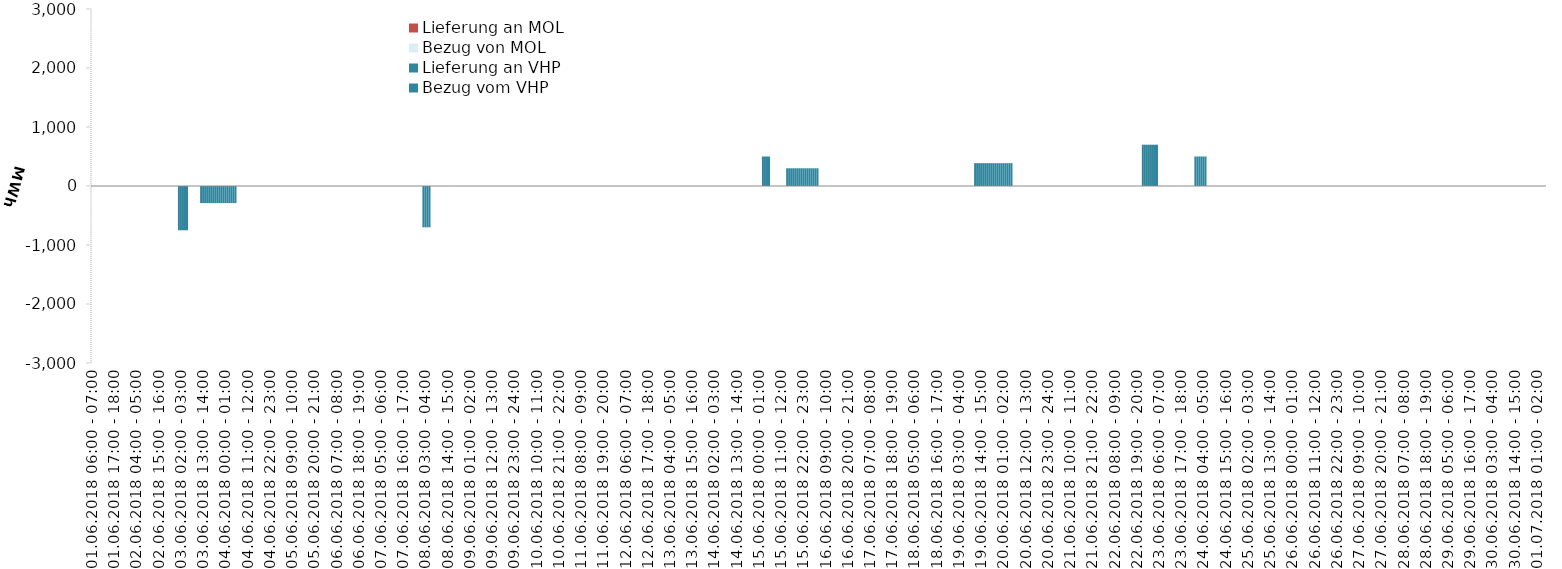
| Category | Bezug vom VHP | Lieferung an VHP | Bezug von MOL | Lieferung an MOL |
|---|---|---|---|---|
| 01.06.2018 06:00 - 07:00 | 0 | 0 | 0 | 0 |
| 01.06.2018 07:00 - 08:00 | 0 | 0 | 0 | 0 |
| 01.06.2018 08:00 - 09:00 | 0 | 0 | 0 | 0 |
| 01.06.2018 09:00 - 10:00 | 0 | 0 | 0 | 0 |
| 01.06.2018 10:00 - 11:00 | 0 | 0 | 0 | 0 |
| 01.06.2018 11:00 - 12:00 | 0 | 0 | 0 | 0 |
| 01.06.2018 12:00 - 13:00 | 0 | 0 | 0 | 0 |
| 01.06.2018 13:00 - 14:00 | 0 | 0 | 0 | 0 |
| 01.06.2018 14:00 - 15:00 | 0 | 0 | 0 | 0 |
| 01.06.2018 15:00 - 16:00 | 0 | 0 | 0 | 0 |
| 01.06.2018 16:00 - 17:00 | 0 | 0 | 0 | 0 |
| 01.06.2018 17:00 - 18:00 | 0 | 0 | 0 | 0 |
| 01.06.2018 18:00 - 19:00 | 0 | 0 | 0 | 0 |
| 01.06.2018 19:00 - 20:00 | 0 | 0 | 0 | 0 |
| 01.06.2018 20:00 - 21:00 | 0 | 0 | 0 | 0 |
| 01.06.2018 21:00 - 22:00 | 0 | 0 | 0 | 0 |
| 01.06.2018 22:00 - 23:00 | 0 | 0 | 0 | 0 |
| 01.06.2018 23:00 - 24:00 | 0 | 0 | 0 | 0 |
| 02.06.2018 00:00 - 01:00 | 0 | 0 | 0 | 0 |
| 02.06.2018 01:00 - 02:00 | 0 | 0 | 0 | 0 |
| 02.06.2018 02:00 - 03:00 | 0 | 0 | 0 | 0 |
| 02.06.2018 03:00 - 04:00 | 0 | 0 | 0 | 0 |
| 02.06.2018 04:00 - 05:00 | 0 | 0 | 0 | 0 |
| 02.06.2018 05:00 - 06:00 | 0 | 0 | 0 | 0 |
| 02.06.2018 06:00 - 07:00 | 0 | 0 | 0 | 0 |
| 02.06.2018 07:00 - 08:00 | 0 | 0 | 0 | 0 |
| 02.06.2018 08:00 - 09:00 | 0 | 0 | 0 | 0 |
| 02.06.2018 09:00 - 10:00 | 0 | 0 | 0 | 0 |
| 02.06.2018 10:00 - 11:00 | 0 | 0 | 0 | 0 |
| 02.06.2018 11:00 - 12:00 | 0 | 0 | 0 | 0 |
| 02.06.2018 12:00 - 13:00 | 0 | 0 | 0 | 0 |
| 02.06.2018 13:00 - 14:00 | 0 | 0 | 0 | 0 |
| 02.06.2018 14:00 - 15:00 | 0 | 0 | 0 | 0 |
| 02.06.2018 15:00 - 16:00 | 0 | 0 | 0 | 0 |
| 02.06.2018 16:00 - 17:00 | 0 | 0 | 0 | 0 |
| 02.06.2018 17:00 - 18:00 | 0 | 0 | 0 | 0 |
| 02.06.2018 18:00 - 19:00 | 0 | 0 | 0 | 0 |
| 02.06.2018 19:00 - 20:00 | 0 | 0 | 0 | 0 |
| 02.06.2018 20:00 - 21:00 | 0 | 0 | 0 | 0 |
| 02.06.2018 21:00 - 22:00 | 0 | 0 | 0 | 0 |
| 02.06.2018 22:00 - 23:00 | 0 | 0 | 0 | 0 |
| 02.06.2018 23:00 - 24:00 | 0 | 0 | 0 | 0 |
| 03.06.2018 00:00 - 01:00 | 0 | 0 | 0 | 0 |
| 03.06.2018 01:00 - 02:00 | 0 | -750 | 0 | 0 |
| 03.06.2018 02:00 - 03:00 | 0 | -750 | 0 | 0 |
| 03.06.2018 03:00 - 04:00 | 0 | -750 | 0 | 0 |
| 03.06.2018 04:00 - 05:00 | 0 | -750 | 0 | 0 |
| 03.06.2018 05:00 - 06:00 | 0 | -750 | 0 | 0 |
| 03.06.2018 06:00 - 07:00 | 0 | 0 | 0 | 0 |
| 03.06.2018 07:00 - 08:00 | 0 | 0 | 0 | 0 |
| 03.06.2018 08:00 - 09:00 | 0 | 0 | 0 | 0 |
| 03.06.2018 09:00 - 10:00 | 0 | 0 | 0 | 0 |
| 03.06.2018 10:00 - 11:00 | 0 | 0 | 0 | 0 |
| 03.06.2018 11:00 - 12:00 | 0 | 0 | 0 | 0 |
| 03.06.2018 12:00 - 13:00 | 0 | -290 | 0 | 0 |
| 03.06.2018 13:00 - 14:00 | 0 | -290 | 0 | 0 |
| 03.06.2018 14:00 - 15:00 | 0 | -290 | 0 | 0 |
| 03.06.2018 15:00 - 16:00 | 0 | -290 | 0 | 0 |
| 03.06.2018 16:00 - 17:00 | 0 | -290 | 0 | 0 |
| 03.06.2018 17:00 - 18:00 | 0 | -290 | 0 | 0 |
| 03.06.2018 18:00 - 19:00 | 0 | -290 | 0 | 0 |
| 03.06.2018 19:00 - 20:00 | 0 | -290 | 0 | 0 |
| 03.06.2018 20:00 - 21:00 | 0 | -290 | 0 | 0 |
| 03.06.2018 21:00 - 22:00 | 0 | -290 | 0 | 0 |
| 03.06.2018 22:00 - 23:00 | 0 | -290 | 0 | 0 |
| 03.06.2018 23:00 - 24:00 | 0 | -290 | 0 | 0 |
| 04.06.2018 00:00 - 01:00 | 0 | -290 | 0 | 0 |
| 04.06.2018 01:00 - 02:00 | 0 | -290 | 0 | 0 |
| 04.06.2018 02:00 - 03:00 | 0 | -290 | 0 | 0 |
| 04.06.2018 03:00 - 04:00 | 0 | -290 | 0 | 0 |
| 04.06.2018 04:00 - 05:00 | 0 | -290 | 0 | 0 |
| 04.06.2018 05:00 - 06:00 | 0 | -290 | 0 | 0 |
| 04.06.2018 06:00 - 07:00 | 0 | 0 | 0 | 0 |
| 04.06.2018 07:00 - 08:00 | 0 | 0 | 0 | 0 |
| 04.06.2018 08:00 - 09:00 | 0 | 0 | 0 | 0 |
| 04.06.2018 09:00 - 10:00 | 0 | 0 | 0 | 0 |
| 04.06.2018 10:00 - 11:00 | 0 | 0 | 0 | 0 |
| 04.06.2018 11:00 - 12:00 | 0 | 0 | 0 | 0 |
| 04.06.2018 12:00 - 13:00 | 0 | 0 | 0 | 0 |
| 04.06.2018 13:00 - 14:00 | 0 | 0 | 0 | 0 |
| 04.06.2018 14:00 - 15:00 | 0 | 0 | 0 | 0 |
| 04.06.2018 15:00 - 16:00 | 0 | 0 | 0 | 0 |
| 04.06.2018 16:00 - 17:00 | 0 | 0 | 0 | 0 |
| 04.06.2018 17:00 - 18:00 | 0 | 0 | 0 | 0 |
| 04.06.2018 18:00 - 19:00 | 0 | 0 | 0 | 0 |
| 04.06.2018 19:00 - 20:00 | 0 | 0 | 0 | 0 |
| 04.06.2018 20:00 - 21:00 | 0 | 0 | 0 | 0 |
| 04.06.2018 21:00 - 22:00 | 0 | 0 | 0 | 0 |
| 04.06.2018 22:00 - 23:00 | 0 | 0 | 0 | 0 |
| 04.06.2018 23:00 - 24:00 | 0 | 0 | 0 | 0 |
| 05.06.2018 00:00 - 01:00 | 0 | 0 | 0 | 0 |
| 05.06.2018 01:00 - 02:00 | 0 | 0 | 0 | 0 |
| 05.06.2018 02:00 - 03:00 | 0 | 0 | 0 | 0 |
| 05.06.2018 03:00 - 04:00 | 0 | 0 | 0 | 0 |
| 05.06.2018 04:00 - 05:00 | 0 | 0 | 0 | 0 |
| 05.06.2018 05:00 - 06:00 | 0 | 0 | 0 | 0 |
| 05.06.2018 06:00 - 07:00 | 0 | 0 | 0 | 0 |
| 05.06.2018 07:00 - 08:00 | 0 | 0 | 0 | 0 |
| 05.06.2018 08:00 - 09:00 | 0 | 0 | 0 | 0 |
| 05.06.2018 09:00 - 10:00 | 0 | 0 | 0 | 0 |
| 05.06.2018 10:00 - 11:00 | 0 | 0 | 0 | 0 |
| 05.06.2018 11:00 - 12:00 | 0 | 0 | 0 | 0 |
| 05.06.2018 12:00 - 13:00 | 0 | 0 | 0 | 0 |
| 05.06.2018 13:00 - 14:00 | 0 | 0 | 0 | 0 |
| 05.06.2018 14:00 - 15:00 | 0 | 0 | 0 | 0 |
| 05.06.2018 15:00 - 16:00 | 0 | 0 | 0 | 0 |
| 05.06.2018 16:00 - 17:00 | 0 | 0 | 0 | 0 |
| 05.06.2018 17:00 - 18:00 | 0 | 0 | 0 | 0 |
| 05.06.2018 18:00 - 19:00 | 0 | 0 | 0 | 0 |
| 05.06.2018 19:00 - 20:00 | 0 | 0 | 0 | 0 |
| 05.06.2018 20:00 - 21:00 | 0 | 0 | 0 | 0 |
| 05.06.2018 21:00 - 22:00 | 0 | 0 | 0 | 0 |
| 05.06.2018 22:00 - 23:00 | 0 | 0 | 0 | 0 |
| 05.06.2018 23:00 - 24:00 | 0 | 0 | 0 | 0 |
| 06.06.2018 00:00 - 01:00 | 0 | 0 | 0 | 0 |
| 06.06.2018 01:00 - 02:00 | 0 | 0 | 0 | 0 |
| 06.06.2018 02:00 - 03:00 | 0 | 0 | 0 | 0 |
| 06.06.2018 03:00 - 04:00 | 0 | 0 | 0 | 0 |
| 06.06.2018 04:00 - 05:00 | 0 | 0 | 0 | 0 |
| 06.06.2018 05:00 - 06:00 | 0 | 0 | 0 | 0 |
| 06.06.2018 06:00 - 07:00 | 0 | 0 | 0 | 0 |
| 06.06.2018 07:00 - 08:00 | 0 | 0 | 0 | 0 |
| 06.06.2018 08:00 - 09:00 | 0 | 0 | 0 | 0 |
| 06.06.2018 09:00 - 10:00 | 0 | 0 | 0 | 0 |
| 06.06.2018 10:00 - 11:00 | 0 | 0 | 0 | 0 |
| 06.06.2018 11:00 - 12:00 | 0 | 0 | 0 | 0 |
| 06.06.2018 12:00 - 13:00 | 0 | 0 | 0 | 0 |
| 06.06.2018 13:00 - 14:00 | 0 | 0 | 0 | 0 |
| 06.06.2018 14:00 - 15:00 | 0 | 0 | 0 | 0 |
| 06.06.2018 15:00 - 16:00 | 0 | 0 | 0 | 0 |
| 06.06.2018 16:00 - 17:00 | 0 | 0 | 0 | 0 |
| 06.06.2018 17:00 - 18:00 | 0 | 0 | 0 | 0 |
| 06.06.2018 18:00 - 19:00 | 0 | 0 | 0 | 0 |
| 06.06.2018 19:00 - 20:00 | 0 | 0 | 0 | 0 |
| 06.06.2018 20:00 - 21:00 | 0 | 0 | 0 | 0 |
| 06.06.2018 21:00 - 22:00 | 0 | 0 | 0 | 0 |
| 06.06.2018 22:00 - 23:00 | 0 | 0 | 0 | 0 |
| 06.06.2018 23:00 - 24:00 | 0 | 0 | 0 | 0 |
| 07.06.2018 00:00 - 01:00 | 0 | 0 | 0 | 0 |
| 07.06.2018 01:00 - 02:00 | 0 | 0 | 0 | 0 |
| 07.06.2018 02:00 - 03:00 | 0 | 0 | 0 | 0 |
| 07.06.2018 03:00 - 04:00 | 0 | 0 | 0 | 0 |
| 07.06.2018 04:00 - 05:00 | 0 | 0 | 0 | 0 |
| 07.06.2018 05:00 - 06:00 | 0 | 0 | 0 | 0 |
| 07.06.2018 06:00 - 07:00 | 0 | 0 | 0 | 0 |
| 07.06.2018 07:00 - 08:00 | 0 | 0 | 0 | 0 |
| 07.06.2018 08:00 - 09:00 | 0 | 0 | 0 | 0 |
| 07.06.2018 09:00 - 10:00 | 0 | 0 | 0 | 0 |
| 07.06.2018 10:00 - 11:00 | 0 | 0 | 0 | 0 |
| 07.06.2018 11:00 - 12:00 | 0 | 0 | 0 | 0 |
| 07.06.2018 12:00 - 13:00 | 0 | 0 | 0 | 0 |
| 07.06.2018 13:00 - 14:00 | 0 | 0 | 0 | 0 |
| 07.06.2018 14:00 - 15:00 | 0 | 0 | 0 | 0 |
| 07.06.2018 15:00 - 16:00 | 0 | 0 | 0 | 0 |
| 07.06.2018 16:00 - 17:00 | 0 | 0 | 0 | 0 |
| 07.06.2018 17:00 - 18:00 | 0 | 0 | 0 | 0 |
| 07.06.2018 18:00 - 19:00 | 0 | 0 | 0 | 0 |
| 07.06.2018 19:00 - 20:00 | 0 | 0 | 0 | 0 |
| 07.06.2018 20:00 - 21:00 | 0 | 0 | 0 | 0 |
| 07.06.2018 21:00 - 22:00 | 0 | 0 | 0 | 0 |
| 07.06.2018 22:00 - 23:00 | 0 | 0 | 0 | 0 |
| 07.06.2018 23:00 - 24:00 | 0 | 0 | 0 | 0 |
| 08.06.2018 00:00 - 01:00 | 0 | 0 | 0 | 0 |
| 08.06.2018 01:00 - 02:00 | 0 | 0 | 0 | 0 |
| 08.06.2018 02:00 - 03:00 | 0 | -700 | 0 | 0 |
| 08.06.2018 03:00 - 04:00 | 0 | -700 | 0 | 0 |
| 08.06.2018 04:00 - 05:00 | 0 | -700 | 0 | 0 |
| 08.06.2018 05:00 - 06:00 | 0 | -700 | 0 | 0 |
| 08.06.2018 06:00 - 07:00 | 0 | 0 | 0 | 0 |
| 08.06.2018 07:00 - 08:00 | 0 | 0 | 0 | 0 |
| 08.06.2018 08:00 - 09:00 | 0 | 0 | 0 | 0 |
| 08.06.2018 09:00 - 10:00 | 0 | 0 | 0 | 0 |
| 08.06.2018 10:00 - 11:00 | 0 | 0 | 0 | 0 |
| 08.06.2018 11:00 - 12:00 | 0 | 0 | 0 | 0 |
| 08.06.2018 12:00 - 13:00 | 0 | 0 | 0 | 0 |
| 08.06.2018 13:00 - 14:00 | 0 | 0 | 0 | 0 |
| 08.06.2018 14:00 - 15:00 | 0 | 0 | 0 | 0 |
| 08.06.2018 15:00 - 16:00 | 0 | 0 | 0 | 0 |
| 08.06.2018 16:00 - 17:00 | 0 | 0 | 0 | 0 |
| 08.06.2018 17:00 - 18:00 | 0 | 0 | 0 | 0 |
| 08.06.2018 18:00 - 19:00 | 0 | 0 | 0 | 0 |
| 08.06.2018 19:00 - 20:00 | 0 | 0 | 0 | 0 |
| 08.06.2018 20:00 - 21:00 | 0 | 0 | 0 | 0 |
| 08.06.2018 21:00 - 22:00 | 0 | 0 | 0 | 0 |
| 08.06.2018 22:00 - 23:00 | 0 | 0 | 0 | 0 |
| 08.06.2018 23:00 - 24:00 | 0 | 0 | 0 | 0 |
| 09.06.2018 00:00 - 01:00 | 0 | 0 | 0 | 0 |
| 09.06.2018 01:00 - 02:00 | 0 | 0 | 0 | 0 |
| 09.06.2018 02:00 - 03:00 | 0 | 0 | 0 | 0 |
| 09.06.2018 03:00 - 04:00 | 0 | 0 | 0 | 0 |
| 09.06.2018 04:00 - 05:00 | 0 | 0 | 0 | 0 |
| 09.06.2018 05:00 - 06:00 | 0 | 0 | 0 | 0 |
| 09.06.2018 06:00 - 07:00 | 0 | 0 | 0 | 0 |
| 09.06.2018 07:00 - 08:00 | 0 | 0 | 0 | 0 |
| 09.06.2018 08:00 - 09:00 | 0 | 0 | 0 | 0 |
| 09.06.2018 09:00 - 10:00 | 0 | 0 | 0 | 0 |
| 09.06.2018 10:00 - 11:00 | 0 | 0 | 0 | 0 |
| 09.06.2018 11:00 - 12:00 | 0 | 0 | 0 | 0 |
| 09.06.2018 12:00 - 13:00 | 0 | 0 | 0 | 0 |
| 09.06.2018 13:00 - 14:00 | 0 | 0 | 0 | 0 |
| 09.06.2018 14:00 - 15:00 | 0 | 0 | 0 | 0 |
| 09.06.2018 15:00 - 16:00 | 0 | 0 | 0 | 0 |
| 09.06.2018 16:00 - 17:00 | 0 | 0 | 0 | 0 |
| 09.06.2018 17:00 - 18:00 | 0 | 0 | 0 | 0 |
| 09.06.2018 18:00 - 19:00 | 0 | 0 | 0 | 0 |
| 09.06.2018 19:00 - 20:00 | 0 | 0 | 0 | 0 |
| 09.06.2018 20:00 - 21:00 | 0 | 0 | 0 | 0 |
| 09.06.2018 21:00 - 22:00 | 0 | 0 | 0 | 0 |
| 09.06.2018 22:00 - 23:00 | 0 | 0 | 0 | 0 |
| 09.06.2018 23:00 - 24:00 | 0 | 0 | 0 | 0 |
| 10.06.2018 00:00 - 01:00 | 0 | 0 | 0 | 0 |
| 10.06.2018 01:00 - 02:00 | 0 | 0 | 0 | 0 |
| 10.06.2018 02:00 - 03:00 | 0 | 0 | 0 | 0 |
| 10.06.2018 03:00 - 04:00 | 0 | 0 | 0 | 0 |
| 10.06.2018 04:00 - 05:00 | 0 | 0 | 0 | 0 |
| 10.06.2018 05:00 - 06:00 | 0 | 0 | 0 | 0 |
| 10.06.2018 06:00 - 07:00 | 0 | 0 | 0 | 0 |
| 10.06.2018 07:00 - 08:00 | 0 | 0 | 0 | 0 |
| 10.06.2018 08:00 - 09:00 | 0 | 0 | 0 | 0 |
| 10.06.2018 09:00 - 10:00 | 0 | 0 | 0 | 0 |
| 10.06.2018 10:00 - 11:00 | 0 | 0 | 0 | 0 |
| 10.06.2018 11:00 - 12:00 | 0 | 0 | 0 | 0 |
| 10.06.2018 12:00 - 13:00 | 0 | 0 | 0 | 0 |
| 10.06.2018 13:00 - 14:00 | 0 | 0 | 0 | 0 |
| 10.06.2018 14:00 - 15:00 | 0 | 0 | 0 | 0 |
| 10.06.2018 15:00 - 16:00 | 0 | 0 | 0 | 0 |
| 10.06.2018 16:00 - 17:00 | 0 | 0 | 0 | 0 |
| 10.06.2018 17:00 - 18:00 | 0 | 0 | 0 | 0 |
| 10.06.2018 18:00 - 19:00 | 0 | 0 | 0 | 0 |
| 10.06.2018 19:00 - 20:00 | 0 | 0 | 0 | 0 |
| 10.06.2018 20:00 - 21:00 | 0 | 0 | 0 | 0 |
| 10.06.2018 21:00 - 22:00 | 0 | 0 | 0 | 0 |
| 10.06.2018 22:00 - 23:00 | 0 | 0 | 0 | 0 |
| 10.06.2018 23:00 - 24:00 | 0 | 0 | 0 | 0 |
| 11.06.2018 00:00 - 01:00 | 0 | 0 | 0 | 0 |
| 11.06.2018 01:00 - 02:00 | 0 | 0 | 0 | 0 |
| 11.06.2018 02:00 - 03:00 | 0 | 0 | 0 | 0 |
| 11.06.2018 03:00 - 04:00 | 0 | 0 | 0 | 0 |
| 11.06.2018 04:00 - 05:00 | 0 | 0 | 0 | 0 |
| 11.06.2018 05:00 - 06:00 | 0 | 0 | 0 | 0 |
| 11.06.2018 06:00 - 07:00 | 0 | 0 | 0 | 0 |
| 11.06.2018 07:00 - 08:00 | 0 | 0 | 0 | 0 |
| 11.06.2018 08:00 - 09:00 | 0 | 0 | 0 | 0 |
| 11.06.2018 09:00 - 10:00 | 0 | 0 | 0 | 0 |
| 11.06.2018 10:00 - 11:00 | 0 | 0 | 0 | 0 |
| 11.06.2018 11:00 - 12:00 | 0 | 0 | 0 | 0 |
| 11.06.2018 12:00 - 13:00 | 0 | 0 | 0 | 0 |
| 11.06.2018 13:00 - 14:00 | 0 | 0 | 0 | 0 |
| 11.06.2018 14:00 - 15:00 | 0 | 0 | 0 | 0 |
| 11.06.2018 15:00 - 16:00 | 0 | 0 | 0 | 0 |
| 11.06.2018 16:00 - 17:00 | 0 | 0 | 0 | 0 |
| 11.06.2018 17:00 - 18:00 | 0 | 0 | 0 | 0 |
| 11.06.2018 18:00 - 19:00 | 0 | 0 | 0 | 0 |
| 11.06.2018 19:00 - 20:00 | 0 | 0 | 0 | 0 |
| 11.06.2018 20:00 - 21:00 | 0 | 0 | 0 | 0 |
| 11.06.2018 21:00 - 22:00 | 0 | 0 | 0 | 0 |
| 11.06.2018 22:00 - 23:00 | 0 | 0 | 0 | 0 |
| 11.06.2018 23:00 - 24:00 | 0 | 0 | 0 | 0 |
| 12.06.2018 00:00 - 01:00 | 0 | 0 | 0 | 0 |
| 12.06.2018 01:00 - 02:00 | 0 | 0 | 0 | 0 |
| 12.06.2018 02:00 - 03:00 | 0 | 0 | 0 | 0 |
| 12.06.2018 03:00 - 04:00 | 0 | 0 | 0 | 0 |
| 12.06.2018 04:00 - 05:00 | 0 | 0 | 0 | 0 |
| 12.06.2018 05:00 - 06:00 | 0 | 0 | 0 | 0 |
| 12.06.2018 06:00 - 07:00 | 0 | 0 | 0 | 0 |
| 12.06.2018 07:00 - 08:00 | 0 | 0 | 0 | 0 |
| 12.06.2018 08:00 - 09:00 | 0 | 0 | 0 | 0 |
| 12.06.2018 09:00 - 10:00 | 0 | 0 | 0 | 0 |
| 12.06.2018 10:00 - 11:00 | 0 | 0 | 0 | 0 |
| 12.06.2018 11:00 - 12:00 | 0 | 0 | 0 | 0 |
| 12.06.2018 12:00 - 13:00 | 0 | 0 | 0 | 0 |
| 12.06.2018 13:00 - 14:00 | 0 | 0 | 0 | 0 |
| 12.06.2018 14:00 - 15:00 | 0 | 0 | 0 | 0 |
| 12.06.2018 15:00 - 16:00 | 0 | 0 | 0 | 0 |
| 12.06.2018 16:00 - 17:00 | 0 | 0 | 0 | 0 |
| 12.06.2018 17:00 - 18:00 | 0 | 0 | 0 | 0 |
| 12.06.2018 18:00 - 19:00 | 0 | 0 | 0 | 0 |
| 12.06.2018 19:00 - 20:00 | 0 | 0 | 0 | 0 |
| 12.06.2018 20:00 - 21:00 | 0 | 0 | 0 | 0 |
| 12.06.2018 21:00 - 22:00 | 0 | 0 | 0 | 0 |
| 12.06.2018 22:00 - 23:00 | 0 | 0 | 0 | 0 |
| 12.06.2018 23:00 - 24:00 | 0 | 0 | 0 | 0 |
| 13.06.2018 00:00 - 01:00 | 0 | 0 | 0 | 0 |
| 13.06.2018 01:00 - 02:00 | 0 | 0 | 0 | 0 |
| 13.06.2018 02:00 - 03:00 | 0 | 0 | 0 | 0 |
| 13.06.2018 03:00 - 04:00 | 0 | 0 | 0 | 0 |
| 13.06.2018 04:00 - 05:00 | 0 | 0 | 0 | 0 |
| 13.06.2018 05:00 - 06:00 | 0 | 0 | 0 | 0 |
| 13.06.2018 06:00 - 07:00 | 0 | 0 | 0 | 0 |
| 13.06.2018 07:00 - 08:00 | 0 | 0 | 0 | 0 |
| 13.06.2018 08:00 - 09:00 | 0 | 0 | 0 | 0 |
| 13.06.2018 09:00 - 10:00 | 0 | 0 | 0 | 0 |
| 13.06.2018 10:00 - 11:00 | 0 | 0 | 0 | 0 |
| 13.06.2018 11:00 - 12:00 | 0 | 0 | 0 | 0 |
| 13.06.2018 12:00 - 13:00 | 0 | 0 | 0 | 0 |
| 13.06.2018 13:00 - 14:00 | 0 | 0 | 0 | 0 |
| 13.06.2018 14:00 - 15:00 | 0 | 0 | 0 | 0 |
| 13.06.2018 15:00 - 16:00 | 0 | 0 | 0 | 0 |
| 13.06.2018 16:00 - 17:00 | 0 | 0 | 0 | 0 |
| 13.06.2018 17:00 - 18:00 | 0 | 0 | 0 | 0 |
| 13.06.2018 18:00 - 19:00 | 0 | 0 | 0 | 0 |
| 13.06.2018 19:00 - 20:00 | 0 | 0 | 0 | 0 |
| 13.06.2018 20:00 - 21:00 | 0 | 0 | 0 | 0 |
| 13.06.2018 21:00 - 22:00 | 0 | 0 | 0 | 0 |
| 13.06.2018 22:00 - 23:00 | 0 | 0 | 0 | 0 |
| 13.06.2018 23:00 - 24:00 | 0 | 0 | 0 | 0 |
| 14.06.2018 00:00 - 01:00 | 0 | 0 | 0 | 0 |
| 14.06.2018 01:00 - 02:00 | 0 | 0 | 0 | 0 |
| 14.06.2018 02:00 - 03:00 | 0 | 0 | 0 | 0 |
| 14.06.2018 03:00 - 04:00 | 0 | 0 | 0 | 0 |
| 14.06.2018 04:00 - 05:00 | 0 | 0 | 0 | 0 |
| 14.06.2018 05:00 - 06:00 | 0 | 0 | 0 | 0 |
| 14.06.2018 06:00 - 07:00 | 0 | 0 | 0 | 0 |
| 14.06.2018 07:00 - 08:00 | 0 | 0 | 0 | 0 |
| 14.06.2018 08:00 - 09:00 | 0 | 0 | 0 | 0 |
| 14.06.2018 09:00 - 10:00 | 0 | 0 | 0 | 0 |
| 14.06.2018 10:00 - 11:00 | 0 | 0 | 0 | 0 |
| 14.06.2018 11:00 - 12:00 | 0 | 0 | 0 | 0 |
| 14.06.2018 12:00 - 13:00 | 0 | 0 | 0 | 0 |
| 14.06.2018 13:00 - 14:00 | 0 | 0 | 0 | 0 |
| 14.06.2018 14:00 - 15:00 | 0 | 0 | 0 | 0 |
| 14.06.2018 15:00 - 16:00 | 0 | 0 | 0 | 0 |
| 14.06.2018 16:00 - 17:00 | 0 | 0 | 0 | 0 |
| 14.06.2018 17:00 - 18:00 | 0 | 0 | 0 | 0 |
| 14.06.2018 18:00 - 19:00 | 0 | 0 | 0 | 0 |
| 14.06.2018 19:00 - 20:00 | 0 | 0 | 0 | 0 |
| 14.06.2018 20:00 - 21:00 | 0 | 0 | 0 | 0 |
| 14.06.2018 21:00 - 22:00 | 0 | 0 | 0 | 0 |
| 14.06.2018 22:00 - 23:00 | 0 | 0 | 0 | 0 |
| 14.06.2018 23:00 - 24:00 | 0 | 0 | 0 | 0 |
| 15.06.2018 00:00 - 01:00 | 0 | 0 | 0 | 0 |
| 15.06.2018 01:00 - 02:00 | 0 | 0 | 0 | 0 |
| 15.06.2018 02:00 - 03:00 | 500 | 0 | 0 | 0 |
| 15.06.2018 03:00 - 04:00 | 500 | 0 | 0 | 0 |
| 15.06.2018 04:00 - 05:00 | 500 | 0 | 0 | 0 |
| 15.06.2018 05:00 - 06:00 | 500 | 0 | 0 | 0 |
| 15.06.2018 06:00 - 07:00 | 0 | 0 | 0 | 0 |
| 15.06.2018 07:00 - 08:00 | 0 | 0 | 0 | 0 |
| 15.06.2018 08:00 - 09:00 | 0 | 0 | 0 | 0 |
| 15.06.2018 09:00 - 10:00 | 0 | 0 | 0 | 0 |
| 15.06.2018 10:00 - 11:00 | 0 | 0 | 0 | 0 |
| 15.06.2018 11:00 - 12:00 | 0 | 0 | 0 | 0 |
| 15.06.2018 12:00 - 13:00 | 0 | 0 | 0 | 0 |
| 15.06.2018 13:00 - 14:00 | 0 | 0 | 0 | 0 |
| 15.06.2018 14:00 - 15:00 | 300 | 0 | 0 | 0 |
| 15.06.2018 15:00 - 16:00 | 300 | 0 | 0 | 0 |
| 15.06.2018 16:00 - 17:00 | 300 | 0 | 0 | 0 |
| 15.06.2018 17:00 - 18:00 | 300 | 0 | 0 | 0 |
| 15.06.2018 18:00 - 19:00 | 300 | 0 | 0 | 0 |
| 15.06.2018 19:00 - 20:00 | 300 | 0 | 0 | 0 |
| 15.06.2018 20:00 - 21:00 | 300 | 0 | 0 | 0 |
| 15.06.2018 21:00 - 22:00 | 300 | 0 | 0 | 0 |
| 15.06.2018 22:00 - 23:00 | 300 | 0 | 0 | 0 |
| 15.06.2018 23:00 - 24:00 | 300 | 0 | 0 | 0 |
| 16.06.2018 00:00 - 01:00 | 300 | 0 | 0 | 0 |
| 16.06.2018 01:00 - 02:00 | 300 | 0 | 0 | 0 |
| 16.06.2018 02:00 - 03:00 | 300 | 0 | 0 | 0 |
| 16.06.2018 03:00 - 04:00 | 300 | 0 | 0 | 0 |
| 16.06.2018 04:00 - 05:00 | 300 | 0 | 0 | 0 |
| 16.06.2018 05:00 - 06:00 | 300 | 0 | 0 | 0 |
| 16.06.2018 06:00 - 07:00 | 0 | 0 | 0 | 0 |
| 16.06.2018 07:00 - 08:00 | 0 | 0 | 0 | 0 |
| 16.06.2018 08:00 - 09:00 | 0 | 0 | 0 | 0 |
| 16.06.2018 09:00 - 10:00 | 0 | 0 | 0 | 0 |
| 16.06.2018 10:00 - 11:00 | 0 | 0 | 0 | 0 |
| 16.06.2018 11:00 - 12:00 | 0 | 0 | 0 | 0 |
| 16.06.2018 12:00 - 13:00 | 0 | 0 | 0 | 0 |
| 16.06.2018 13:00 - 14:00 | 0 | 0 | 0 | 0 |
| 16.06.2018 14:00 - 15:00 | 0 | 0 | 0 | 0 |
| 16.06.2018 15:00 - 16:00 | 0 | 0 | 0 | 0 |
| 16.06.2018 16:00 - 17:00 | 0 | 0 | 0 | 0 |
| 16.06.2018 17:00 - 18:00 | 0 | 0 | 0 | 0 |
| 16.06.2018 18:00 - 19:00 | 0 | 0 | 0 | 0 |
| 16.06.2018 19:00 - 20:00 | 0 | 0 | 0 | 0 |
| 16.06.2018 20:00 - 21:00 | 0 | 0 | 0 | 0 |
| 16.06.2018 21:00 - 22:00 | 0 | 0 | 0 | 0 |
| 16.06.2018 22:00 - 23:00 | 0 | 0 | 0 | 0 |
| 16.06.2018 23:00 - 24:00 | 0 | 0 | 0 | 0 |
| 17.06.2018 00:00 - 01:00 | 0 | 0 | 0 | 0 |
| 17.06.2018 01:00 - 02:00 | 0 | 0 | 0 | 0 |
| 17.06.2018 02:00 - 03:00 | 0 | 0 | 0 | 0 |
| 17.06.2018 03:00 - 04:00 | 0 | 0 | 0 | 0 |
| 17.06.2018 04:00 - 05:00 | 0 | 0 | 0 | 0 |
| 17.06.2018 05:00 - 06:00 | 0 | 0 | 0 | 0 |
| 17.06.2018 06:00 - 07:00 | 0 | 0 | 0 | 0 |
| 17.06.2018 07:00 - 08:00 | 0 | 0 | 0 | 0 |
| 17.06.2018 08:00 - 09:00 | 0 | 0 | 0 | 0 |
| 17.06.2018 09:00 - 10:00 | 0 | 0 | 0 | 0 |
| 17.06.2018 10:00 - 11:00 | 0 | 0 | 0 | 0 |
| 17.06.2018 11:00 - 12:00 | 0 | 0 | 0 | 0 |
| 17.06.2018 12:00 - 13:00 | 0 | 0 | 0 | 0 |
| 17.06.2018 13:00 - 14:00 | 0 | 0 | 0 | 0 |
| 17.06.2018 14:00 - 15:00 | 0 | 0 | 0 | 0 |
| 17.06.2018 15:00 - 16:00 | 0 | 0 | 0 | 0 |
| 17.06.2018 16:00 - 17:00 | 0 | 0 | 0 | 0 |
| 17.06.2018 17:00 - 18:00 | 0 | 0 | 0 | 0 |
| 17.06.2018 18:00 - 19:00 | 0 | 0 | 0 | 0 |
| 17.06.2018 19:00 - 20:00 | 0 | 0 | 0 | 0 |
| 17.06.2018 20:00 - 21:00 | 0 | 0 | 0 | 0 |
| 17.06.2018 21:00 - 22:00 | 0 | 0 | 0 | 0 |
| 17.06.2018 22:00 - 23:00 | 0 | 0 | 0 | 0 |
| 17.06.2018 23:00 - 24:00 | 0 | 0 | 0 | 0 |
| 18.06.2018 00:00 - 01:00 | 0 | 0 | 0 | 0 |
| 18.06.2018 01:00 - 02:00 | 0 | 0 | 0 | 0 |
| 18.06.2018 02:00 - 03:00 | 0 | 0 | 0 | 0 |
| 18.06.2018 03:00 - 04:00 | 0 | 0 | 0 | 0 |
| 18.06.2018 04:00 - 05:00 | 0 | 0 | 0 | 0 |
| 18.06.2018 05:00 - 06:00 | 0 | 0 | 0 | 0 |
| 18.06.2018 06:00 - 07:00 | 0 | 0 | 0 | 0 |
| 18.06.2018 07:00 - 08:00 | 0 | 0 | 0 | 0 |
| 18.06.2018 08:00 - 09:00 | 0 | 0 | 0 | 0 |
| 18.06.2018 09:00 - 10:00 | 0 | 0 | 0 | 0 |
| 18.06.2018 10:00 - 11:00 | 0 | 0 | 0 | 0 |
| 18.06.2018 11:00 - 12:00 | 0 | 0 | 0 | 0 |
| 18.06.2018 12:00 - 13:00 | 0 | 0 | 0 | 0 |
| 18.06.2018 13:00 - 14:00 | 0 | 0 | 0 | 0 |
| 18.06.2018 14:00 - 15:00 | 0 | 0 | 0 | 0 |
| 18.06.2018 15:00 - 16:00 | 0 | 0 | 0 | 0 |
| 18.06.2018 16:00 - 17:00 | 0 | 0 | 0 | 0 |
| 18.06.2018 17:00 - 18:00 | 0 | 0 | 0 | 0 |
| 18.06.2018 18:00 - 19:00 | 0 | 0 | 0 | 0 |
| 18.06.2018 19:00 - 20:00 | 0 | 0 | 0 | 0 |
| 18.06.2018 20:00 - 21:00 | 0 | 0 | 0 | 0 |
| 18.06.2018 21:00 - 22:00 | 0 | 0 | 0 | 0 |
| 18.06.2018 22:00 - 23:00 | 0 | 0 | 0 | 0 |
| 18.06.2018 23:00 - 24:00 | 0 | 0 | 0 | 0 |
| 19.06.2018 00:00 - 01:00 | 0 | 0 | 0 | 0 |
| 19.06.2018 01:00 - 02:00 | 0 | 0 | 0 | 0 |
| 19.06.2018 02:00 - 03:00 | 0 | 0 | 0 | 0 |
| 19.06.2018 03:00 - 04:00 | 0 | 0 | 0 | 0 |
| 19.06.2018 04:00 - 05:00 | 0 | 0 | 0 | 0 |
| 19.06.2018 05:00 - 06:00 | 0 | 0 | 0 | 0 |
| 19.06.2018 06:00 - 07:00 | 0 | 0 | 0 | 0 |
| 19.06.2018 07:00 - 08:00 | 0 | 0 | 0 | 0 |
| 19.06.2018 08:00 - 09:00 | 0 | 0 | 0 | 0 |
| 19.06.2018 09:00 - 10:00 | 0 | 0 | 0 | 0 |
| 19.06.2018 10:00 - 11:00 | 0 | 0 | 0 | 0 |
| 19.06.2018 11:00 - 12:00 | 387 | 0 | 0 | 0 |
| 19.06.2018 12:00 - 13:00 | 387 | 0 | 0 | 0 |
| 19.06.2018 13:00 - 14:00 | 387 | 0 | 0 | 0 |
| 19.06.2018 14:00 - 15:00 | 387 | 0 | 0 | 0 |
| 19.06.2018 15:00 - 16:00 | 387 | 0 | 0 | 0 |
| 19.06.2018 16:00 - 17:00 | 387 | 0 | 0 | 0 |
| 19.06.2018 17:00 - 18:00 | 387 | 0 | 0 | 0 |
| 19.06.2018 18:00 - 19:00 | 387 | 0 | 0 | 0 |
| 19.06.2018 19:00 - 20:00 | 387 | 0 | 0 | 0 |
| 19.06.2018 20:00 - 21:00 | 387 | 0 | 0 | 0 |
| 19.06.2018 21:00 - 22:00 | 387 | 0 | 0 | 0 |
| 19.06.2018 22:00 - 23:00 | 387 | 0 | 0 | 0 |
| 19.06.2018 23:00 - 24:00 | 387 | 0 | 0 | 0 |
| 20.06.2018 00:00 - 01:00 | 387 | 0 | 0 | 0 |
| 20.06.2018 01:00 - 02:00 | 387 | 0 | 0 | 0 |
| 20.06.2018 02:00 - 03:00 | 387 | 0 | 0 | 0 |
| 20.06.2018 03:00 - 04:00 | 387 | 0 | 0 | 0 |
| 20.06.2018 04:00 - 05:00 | 387 | 0 | 0 | 0 |
| 20.06.2018 05:00 - 06:00 | 387 | 0 | 0 | 0 |
| 20.06.2018 06:00 - 07:00 | 0 | 0 | 0 | 0 |
| 20.06.2018 07:00 - 08:00 | 0 | 0 | 0 | 0 |
| 20.06.2018 08:00 - 09:00 | 0 | 0 | 0 | 0 |
| 20.06.2018 09:00 - 10:00 | 0 | 0 | 0 | 0 |
| 20.06.2018 10:00 - 11:00 | 0 | 0 | 0 | 0 |
| 20.06.2018 11:00 - 12:00 | 0 | 0 | 0 | 0 |
| 20.06.2018 12:00 - 13:00 | 0 | 0 | 0 | 0 |
| 20.06.2018 13:00 - 14:00 | 0 | 0 | 0 | 0 |
| 20.06.2018 14:00 - 15:00 | 0 | 0 | 0 | 0 |
| 20.06.2018 15:00 - 16:00 | 0 | 0 | 0 | 0 |
| 20.06.2018 16:00 - 17:00 | 0 | 0 | 0 | 0 |
| 20.06.2018 17:00 - 18:00 | 0 | 0 | 0 | 0 |
| 20.06.2018 18:00 - 19:00 | 0 | 0 | 0 | 0 |
| 20.06.2018 19:00 - 20:00 | 0 | 0 | 0 | 0 |
| 20.06.2018 20:00 - 21:00 | 0 | 0 | 0 | 0 |
| 20.06.2018 21:00 - 22:00 | 0 | 0 | 0 | 0 |
| 20.06.2018 22:00 - 23:00 | 0 | 0 | 0 | 0 |
| 20.06.2018 23:00 - 24:00 | 0 | 0 | 0 | 0 |
| 21.06.2018 00:00 - 01:00 | 0 | 0 | 0 | 0 |
| 21.06.2018 01:00 - 02:00 | 0 | 0 | 0 | 0 |
| 21.06.2018 02:00 - 03:00 | 0 | 0 | 0 | 0 |
| 21.06.2018 03:00 - 04:00 | 0 | 0 | 0 | 0 |
| 21.06.2018 04:00 - 05:00 | 0 | 0 | 0 | 0 |
| 21.06.2018 05:00 - 06:00 | 0 | 0 | 0 | 0 |
| 21.06.2018 06:00 - 07:00 | 0 | 0 | 0 | 0 |
| 21.06.2018 07:00 - 08:00 | 0 | 0 | 0 | 0 |
| 21.06.2018 08:00 - 09:00 | 0 | 0 | 0 | 0 |
| 21.06.2018 09:00 - 10:00 | 0 | 0 | 0 | 0 |
| 21.06.2018 10:00 - 11:00 | 0 | 0 | 0 | 0 |
| 21.06.2018 11:00 - 12:00 | 0 | 0 | 0 | 0 |
| 21.06.2018 12:00 - 13:00 | 0 | 0 | 0 | 0 |
| 21.06.2018 13:00 - 14:00 | 0 | 0 | 0 | 0 |
| 21.06.2018 14:00 - 15:00 | 0 | 0 | 0 | 0 |
| 21.06.2018 15:00 - 16:00 | 0 | 0 | 0 | 0 |
| 21.06.2018 16:00 - 17:00 | 0 | 0 | 0 | 0 |
| 21.06.2018 17:00 - 18:00 | 0 | 0 | 0 | 0 |
| 21.06.2018 18:00 - 19:00 | 0 | 0 | 0 | 0 |
| 21.06.2018 19:00 - 20:00 | 0 | 0 | 0 | 0 |
| 21.06.2018 20:00 - 21:00 | 0 | 0 | 0 | 0 |
| 21.06.2018 21:00 - 22:00 | 0 | 0 | 0 | 0 |
| 21.06.2018 22:00 - 23:00 | 0 | 0 | 0 | 0 |
| 21.06.2018 23:00 - 24:00 | 0 | 0 | 0 | 0 |
| 22.06.2018 00:00 - 01:00 | 0 | 0 | 0 | 0 |
| 22.06.2018 01:00 - 02:00 | 0 | 0 | 0 | 0 |
| 22.06.2018 02:00 - 03:00 | 0 | 0 | 0 | 0 |
| 22.06.2018 03:00 - 04:00 | 0 | 0 | 0 | 0 |
| 22.06.2018 04:00 - 05:00 | 0 | 0 | 0 | 0 |
| 22.06.2018 05:00 - 06:00 | 0 | 0 | 0 | 0 |
| 22.06.2018 06:00 - 07:00 | 0 | 0 | 0 | 0 |
| 22.06.2018 07:00 - 08:00 | 0 | 0 | 0 | 0 |
| 22.06.2018 08:00 - 09:00 | 0 | 0 | 0 | 0 |
| 22.06.2018 09:00 - 10:00 | 0 | 0 | 0 | 0 |
| 22.06.2018 10:00 - 11:00 | 0 | 0 | 0 | 0 |
| 22.06.2018 11:00 - 12:00 | 0 | 0 | 0 | 0 |
| 22.06.2018 12:00 - 13:00 | 0 | 0 | 0 | 0 |
| 22.06.2018 13:00 - 14:00 | 0 | 0 | 0 | 0 |
| 22.06.2018 14:00 - 15:00 | 0 | 0 | 0 | 0 |
| 22.06.2018 15:00 - 16:00 | 0 | 0 | 0 | 0 |
| 22.06.2018 16:00 - 17:00 | 0 | 0 | 0 | 0 |
| 22.06.2018 17:00 - 18:00 | 0 | 0 | 0 | 0 |
| 22.06.2018 18:00 - 19:00 | 0 | 0 | 0 | 0 |
| 22.06.2018 19:00 - 20:00 | 0 | 0 | 0 | 0 |
| 22.06.2018 20:00 - 21:00 | 0 | 0 | 0 | 0 |
| 22.06.2018 21:00 - 22:00 | 0 | 0 | 0 | 0 |
| 22.06.2018 22:00 - 23:00 | 700 | 0 | 0 | 0 |
| 22.06.2018 23:00 - 24:00 | 700 | 0 | 0 | 0 |
| 23.06.2018 00:00 - 01:00 | 700 | 0 | 0 | 0 |
| 23.06.2018 01:00 - 02:00 | 700 | 0 | 0 | 0 |
| 23.06.2018 02:00 - 03:00 | 700 | 0 | 0 | 0 |
| 23.06.2018 03:00 - 04:00 | 700 | 0 | 0 | 0 |
| 23.06.2018 04:00 - 05:00 | 700 | 0 | 0 | 0 |
| 23.06.2018 05:00 - 06:00 | 700 | 0 | 0 | 0 |
| 23.06.2018 06:00 - 07:00 | 0 | 0 | 0 | 0 |
| 23.06.2018 07:00 - 08:00 | 0 | 0 | 0 | 0 |
| 23.06.2018 08:00 - 09:00 | 0 | 0 | 0 | 0 |
| 23.06.2018 09:00 - 10:00 | 0 | 0 | 0 | 0 |
| 23.06.2018 10:00 - 11:00 | 0 | 0 | 0 | 0 |
| 23.06.2018 11:00 - 12:00 | 0 | 0 | 0 | 0 |
| 23.06.2018 12:00 - 13:00 | 0 | 0 | 0 | 0 |
| 23.06.2018 13:00 - 14:00 | 0 | 0 | 0 | 0 |
| 23.06.2018 14:00 - 15:00 | 0 | 0 | 0 | 0 |
| 23.06.2018 15:00 - 16:00 | 0 | 0 | 0 | 0 |
| 23.06.2018 16:00 - 17:00 | 0 | 0 | 0 | 0 |
| 23.06.2018 17:00 - 18:00 | 0 | 0 | 0 | 0 |
| 23.06.2018 18:00 - 19:00 | 0 | 0 | 0 | 0 |
| 23.06.2018 19:00 - 20:00 | 0 | 0 | 0 | 0 |
| 23.06.2018 20:00 - 21:00 | 0 | 0 | 0 | 0 |
| 23.06.2018 21:00 - 22:00 | 0 | 0 | 0 | 0 |
| 23.06.2018 22:00 - 23:00 | 0 | 0 | 0 | 0 |
| 23.06.2018 23:00 - 24:00 | 0 | 0 | 0 | 0 |
| 24.06.2018 00:00 - 01:00 | 500 | 0 | 0 | 0 |
| 24.06.2018 01:00 - 02:00 | 500 | 0 | 0 | 0 |
| 24.06.2018 02:00 - 03:00 | 500 | 0 | 0 | 0 |
| 24.06.2018 03:00 - 04:00 | 500 | 0 | 0 | 0 |
| 24.06.2018 04:00 - 05:00 | 500 | 0 | 0 | 0 |
| 24.06.2018 05:00 - 06:00 | 500 | 0 | 0 | 0 |
| 24.06.2018 06:00 - 07:00 | 0 | 0 | 0 | 0 |
| 24.06.2018 07:00 - 08:00 | 0 | 0 | 0 | 0 |
| 24.06.2018 08:00 - 09:00 | 0 | 0 | 0 | 0 |
| 24.06.2018 09:00 - 10:00 | 0 | 0 | 0 | 0 |
| 24.06.2018 10:00 - 11:00 | 0 | 0 | 0 | 0 |
| 24.06.2018 11:00 - 12:00 | 0 | 0 | 0 | 0 |
| 24.06.2018 12:00 - 13:00 | 0 | 0 | 0 | 0 |
| 24.06.2018 13:00 - 14:00 | 0 | 0 | 0 | 0 |
| 24.06.2018 14:00 - 15:00 | 0 | 0 | 0 | 0 |
| 24.06.2018 15:00 - 16:00 | 0 | 0 | 0 | 0 |
| 24.06.2018 16:00 - 17:00 | 0 | 0 | 0 | 0 |
| 24.06.2018 17:00 - 18:00 | 0 | 0 | 0 | 0 |
| 24.06.2018 18:00 - 19:00 | 0 | 0 | 0 | 0 |
| 24.06.2018 19:00 - 20:00 | 0 | 0 | 0 | 0 |
| 24.06.2018 20:00 - 21:00 | 0 | 0 | 0 | 0 |
| 24.06.2018 21:00 - 22:00 | 0 | 0 | 0 | 0 |
| 24.06.2018 22:00 - 23:00 | 0 | 0 | 0 | 0 |
| 24.06.2018 23:00 - 24:00 | 0 | 0 | 0 | 0 |
| 25.06.2018 00:00 - 01:00 | 0 | 0 | 0 | 0 |
| 25.06.2018 01:00 - 02:00 | 0 | 0 | 0 | 0 |
| 25.06.2018 02:00 - 03:00 | 0 | 0 | 0 | 0 |
| 25.06.2018 03:00 - 04:00 | 0 | 0 | 0 | 0 |
| 25.06.2018 04:00 - 05:00 | 0 | 0 | 0 | 0 |
| 25.06.2018 05:00 - 06:00 | 0 | 0 | 0 | 0 |
| 25.06.2018 06:00 - 07:00 | 0 | 0 | 0 | 0 |
| 25.06.2018 07:00 - 08:00 | 0 | 0 | 0 | 0 |
| 25.06.2018 08:00 - 09:00 | 0 | 0 | 0 | 0 |
| 25.06.2018 09:00 - 10:00 | 0 | 0 | 0 | 0 |
| 25.06.2018 10:00 - 11:00 | 0 | 0 | 0 | 0 |
| 25.06.2018 11:00 - 12:00 | 0 | 0 | 0 | 0 |
| 25.06.2018 12:00 - 13:00 | 0 | 0 | 0 | 0 |
| 25.06.2018 13:00 - 14:00 | 0 | 0 | 0 | 0 |
| 25.06.2018 14:00 - 15:00 | 0 | 0 | 0 | 0 |
| 25.06.2018 15:00 - 16:00 | 0 | 0 | 0 | 0 |
| 25.06.2018 16:00 - 17:00 | 0 | 0 | 0 | 0 |
| 25.06.2018 17:00 - 18:00 | 0 | 0 | 0 | 0 |
| 25.06.2018 18:00 - 19:00 | 0 | 0 | 0 | 0 |
| 25.06.2018 19:00 - 20:00 | 0 | 0 | 0 | 0 |
| 25.06.2018 20:00 - 21:00 | 0 | 0 | 0 | 0 |
| 25.06.2018 21:00 - 22:00 | 0 | 0 | 0 | 0 |
| 25.06.2018 22:00 - 23:00 | 0 | 0 | 0 | 0 |
| 25.06.2018 23:00 - 24:00 | 0 | 0 | 0 | 0 |
| 26.06.2018 00:00 - 01:00 | 0 | 0 | 0 | 0 |
| 26.06.2018 01:00 - 02:00 | 0 | 0 | 0 | 0 |
| 26.06.2018 02:00 - 03:00 | 0 | 0 | 0 | 0 |
| 26.06.2018 03:00 - 04:00 | 0 | 0 | 0 | 0 |
| 26.06.2018 04:00 - 05:00 | 0 | 0 | 0 | 0 |
| 26.06.2018 05:00 - 06:00 | 0 | 0 | 0 | 0 |
| 26.06.2018 06:00 - 07:00 | 0 | 0 | 0 | 0 |
| 26.06.2018 07:00 - 08:00 | 0 | 0 | 0 | 0 |
| 26.06.2018 08:00 - 09:00 | 0 | 0 | 0 | 0 |
| 26.06.2018 09:00 - 10:00 | 0 | 0 | 0 | 0 |
| 26.06.2018 10:00 - 11:00 | 0 | 0 | 0 | 0 |
| 26.06.2018 11:00 - 12:00 | 0 | 0 | 0 | 0 |
| 26.06.2018 12:00 - 13:00 | 0 | 0 | 0 | 0 |
| 26.06.2018 13:00 - 14:00 | 0 | 0 | 0 | 0 |
| 26.06.2018 14:00 - 15:00 | 0 | 0 | 0 | 0 |
| 26.06.2018 15:00 - 16:00 | 0 | 0 | 0 | 0 |
| 26.06.2018 16:00 - 17:00 | 0 | 0 | 0 | 0 |
| 26.06.2018 17:00 - 18:00 | 0 | 0 | 0 | 0 |
| 26.06.2018 18:00 - 19:00 | 0 | 0 | 0 | 0 |
| 26.06.2018 19:00 - 20:00 | 0 | 0 | 0 | 0 |
| 26.06.2018 20:00 - 21:00 | 0 | 0 | 0 | 0 |
| 26.06.2018 21:00 - 22:00 | 0 | 0 | 0 | 0 |
| 26.06.2018 22:00 - 23:00 | 0 | 0 | 0 | 0 |
| 26.06.2018 23:00 - 24:00 | 0 | 0 | 0 | 0 |
| 27.06.2018 00:00 - 01:00 | 0 | 0 | 0 | 0 |
| 27.06.2018 01:00 - 02:00 | 0 | 0 | 0 | 0 |
| 27.06.2018 02:00 - 03:00 | 0 | 0 | 0 | 0 |
| 27.06.2018 03:00 - 04:00 | 0 | 0 | 0 | 0 |
| 27.06.2018 04:00 - 05:00 | 0 | 0 | 0 | 0 |
| 27.06.2018 05:00 - 06:00 | 0 | 0 | 0 | 0 |
| 27.06.2018 06:00 - 07:00 | 0 | 0 | 0 | 0 |
| 27.06.2018 07:00 - 08:00 | 0 | 0 | 0 | 0 |
| 27.06.2018 08:00 - 09:00 | 0 | 0 | 0 | 0 |
| 27.06.2018 09:00 - 10:00 | 0 | 0 | 0 | 0 |
| 27.06.2018 10:00 - 11:00 | 0 | 0 | 0 | 0 |
| 27.06.2018 11:00 - 12:00 | 0 | 0 | 0 | 0 |
| 27.06.2018 12:00 - 13:00 | 0 | 0 | 0 | 0 |
| 27.06.2018 13:00 - 14:00 | 0 | 0 | 0 | 0 |
| 27.06.2018 14:00 - 15:00 | 0 | 0 | 0 | 0 |
| 27.06.2018 15:00 - 16:00 | 0 | 0 | 0 | 0 |
| 27.06.2018 16:00 - 17:00 | 0 | 0 | 0 | 0 |
| 27.06.2018 17:00 - 18:00 | 0 | 0 | 0 | 0 |
| 27.06.2018 18:00 - 19:00 | 0 | 0 | 0 | 0 |
| 27.06.2018 19:00 - 20:00 | 0 | 0 | 0 | 0 |
| 27.06.2018 20:00 - 21:00 | 0 | 0 | 0 | 0 |
| 27.06.2018 21:00 - 22:00 | 0 | 0 | 0 | 0 |
| 27.06.2018 22:00 - 23:00 | 0 | 0 | 0 | 0 |
| 27.06.2018 23:00 - 24:00 | 0 | 0 | 0 | 0 |
| 28.06.2018 00:00 - 01:00 | 0 | 0 | 0 | 0 |
| 28.06.2018 01:00 - 02:00 | 0 | 0 | 0 | 0 |
| 28.06.2018 02:00 - 03:00 | 0 | 0 | 0 | 0 |
| 28.06.2018 03:00 - 04:00 | 0 | 0 | 0 | 0 |
| 28.06.2018 04:00 - 05:00 | 0 | 0 | 0 | 0 |
| 28.06.2018 05:00 - 06:00 | 0 | 0 | 0 | 0 |
| 28.06.2018 06:00 - 07:00 | 0 | 0 | 0 | 0 |
| 28.06.2018 07:00 - 08:00 | 0 | 0 | 0 | 0 |
| 28.06.2018 08:00 - 09:00 | 0 | 0 | 0 | 0 |
| 28.06.2018 09:00 - 10:00 | 0 | 0 | 0 | 0 |
| 28.06.2018 10:00 - 11:00 | 0 | 0 | 0 | 0 |
| 28.06.2018 11:00 - 12:00 | 0 | 0 | 0 | 0 |
| 28.06.2018 12:00 - 13:00 | 0 | 0 | 0 | 0 |
| 28.06.2018 13:00 - 14:00 | 0 | 0 | 0 | 0 |
| 28.06.2018 14:00 - 15:00 | 0 | 0 | 0 | 0 |
| 28.06.2018 15:00 - 16:00 | 0 | 0 | 0 | 0 |
| 28.06.2018 16:00 - 17:00 | 0 | 0 | 0 | 0 |
| 28.06.2018 17:00 - 18:00 | 0 | 0 | 0 | 0 |
| 28.06.2018 18:00 - 19:00 | 0 | 0 | 0 | 0 |
| 28.06.2018 19:00 - 20:00 | 0 | 0 | 0 | 0 |
| 28.06.2018 20:00 - 21:00 | 0 | 0 | 0 | 0 |
| 28.06.2018 21:00 - 22:00 | 0 | 0 | 0 | 0 |
| 28.06.2018 22:00 - 23:00 | 0 | 0 | 0 | 0 |
| 28.06.2018 23:00 - 24:00 | 0 | 0 | 0 | 0 |
| 29.06.2018 00:00 - 01:00 | 0 | 0 | 0 | 0 |
| 29.06.2018 01:00 - 02:00 | 0 | 0 | 0 | 0 |
| 29.06.2018 02:00 - 03:00 | 0 | 0 | 0 | 0 |
| 29.06.2018 03:00 - 04:00 | 0 | 0 | 0 | 0 |
| 29.06.2018 04:00 - 05:00 | 0 | 0 | 0 | 0 |
| 29.06.2018 05:00 - 06:00 | 0 | 0 | 0 | 0 |
| 29.06.2018 06:00 - 07:00 | 0 | 0 | 0 | 0 |
| 29.06.2018 07:00 - 08:00 | 0 | 0 | 0 | 0 |
| 29.06.2018 08:00 - 09:00 | 0 | 0 | 0 | 0 |
| 29.06.2018 09:00 - 10:00 | 0 | 0 | 0 | 0 |
| 29.06.2018 10:00 - 11:00 | 0 | 0 | 0 | 0 |
| 29.06.2018 11:00 - 12:00 | 0 | 0 | 0 | 0 |
| 29.06.2018 12:00 - 13:00 | 0 | 0 | 0 | 0 |
| 29.06.2018 13:00 - 14:00 | 0 | 0 | 0 | 0 |
| 29.06.2018 14:00 - 15:00 | 0 | 0 | 0 | 0 |
| 29.06.2018 15:00 - 16:00 | 0 | 0 | 0 | 0 |
| 29.06.2018 16:00 - 17:00 | 0 | 0 | 0 | 0 |
| 29.06.2018 17:00 - 18:00 | 0 | 0 | 0 | 0 |
| 29.06.2018 18:00 - 19:00 | 0 | 0 | 0 | 0 |
| 29.06.2018 19:00 - 20:00 | 0 | 0 | 0 | 0 |
| 29.06.2018 20:00 - 21:00 | 0 | 0 | 0 | 0 |
| 29.06.2018 21:00 - 22:00 | 0 | 0 | 0 | 0 |
| 29.06.2018 22:00 - 23:00 | 0 | 0 | 0 | 0 |
| 29.06.2018 23:00 - 24:00 | 0 | 0 | 0 | 0 |
| 30.06.2018 00:00 - 01:00 | 0 | 0 | 0 | 0 |
| 30.06.2018 01:00 - 02:00 | 0 | 0 | 0 | 0 |
| 30.06.2018 02:00 - 03:00 | 0 | 0 | 0 | 0 |
| 30.06.2018 03:00 - 04:00 | 0 | 0 | 0 | 0 |
| 30.06.2018 04:00 - 05:00 | 0 | 0 | 0 | 0 |
| 30.06.2018 05:00 - 06:00 | 0 | 0 | 0 | 0 |
| 30.06.2018 06:00 - 07:00 | 0 | 0 | 0 | 0 |
| 30.06.2018 07:00 - 08:00 | 0 | 0 | 0 | 0 |
| 30.06.2018 08:00 - 09:00 | 0 | 0 | 0 | 0 |
| 30.06.2018 09:00 - 10:00 | 0 | 0 | 0 | 0 |
| 30.06.2018 10:00 - 11:00 | 0 | 0 | 0 | 0 |
| 30.06.2018 11:00 - 12:00 | 0 | 0 | 0 | 0 |
| 30.06.2018 12:00 - 13:00 | 0 | 0 | 0 | 0 |
| 30.06.2018 13:00 - 14:00 | 0 | 0 | 0 | 0 |
| 30.06.2018 14:00 - 15:00 | 0 | 0 | 0 | 0 |
| 30.06.2018 15:00 - 16:00 | 0 | 0 | 0 | 0 |
| 30.06.2018 16:00 - 17:00 | 0 | 0 | 0 | 0 |
| 30.06.2018 17:00 - 18:00 | 0 | 0 | 0 | 0 |
| 30.06.2018 18:00 - 19:00 | 0 | 0 | 0 | 0 |
| 30.06.2018 19:00 - 20:00 | 0 | 0 | 0 | 0 |
| 30.06.2018 20:00 - 21:00 | 0 | 0 | 0 | 0 |
| 30.06.2018 21:00 - 22:00 | 0 | 0 | 0 | 0 |
| 30.06.2018 22:00 - 23:00 | 0 | 0 | 0 | 0 |
| 30.06.2018 23:00 - 24:00 | 0 | 0 | 0 | 0 |
| 01.07.2018 00:00 - 01:00 | 0 | 0 | 0 | 0 |
| 01.07.2018 01:00 - 02:00 | 0 | 0 | 0 | 0 |
| 01.07.2018 02:00 - 03:00 | 0 | 0 | 0 | 0 |
| 01.07.2018 03:00 - 04:00 | 0 | 0 | 0 | 0 |
| 01.07.2018 04:00 - 05:00 | 0 | 0 | 0 | 0 |
| 01.07.2018 05:00 - 06:00 | 0 | 0 | 0 | 0 |